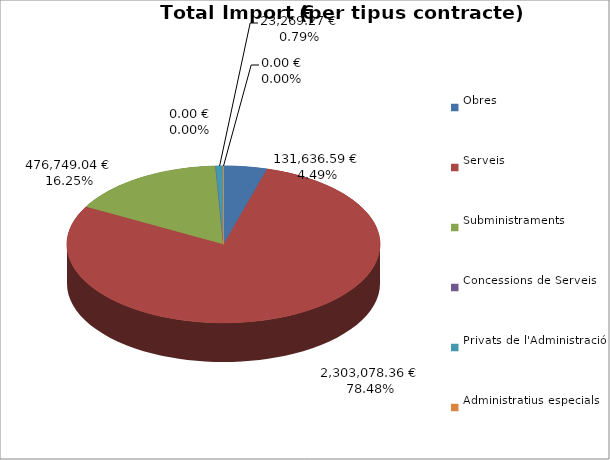
| Category | Total preu
(amb IVA) |
|---|---|
| Obres | 131636.59 |
| Serveis | 2303078.36 |
| Subministraments | 476749.04 |
| Concessions de Serveis | 0 |
| Privats de l'Administració | 23269.27 |
| Administratius especials | 0 |